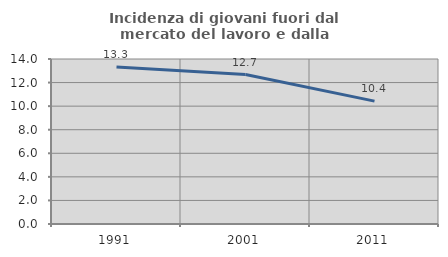
| Category | Incidenza di giovani fuori dal mercato del lavoro e dalla formazione  |
|---|---|
| 1991.0 | 13.315 |
| 2001.0 | 12.679 |
| 2011.0 | 10.428 |